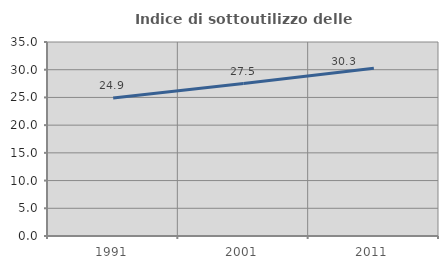
| Category | Indice di sottoutilizzo delle abitazioni  |
|---|---|
| 1991.0 | 24.902 |
| 2001.0 | 27.498 |
| 2011.0 | 30.258 |